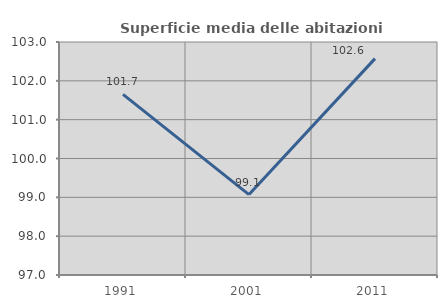
| Category | Superficie media delle abitazioni occupate |
|---|---|
| 1991.0 | 101.652 |
| 2001.0 | 99.07 |
| 2011.0 | 102.572 |